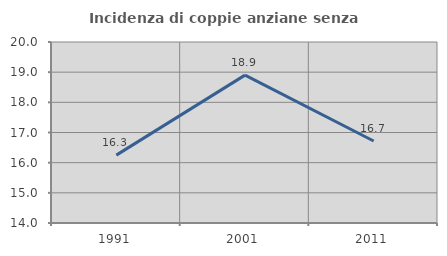
| Category | Incidenza di coppie anziane senza figli  |
|---|---|
| 1991.0 | 16.25 |
| 2001.0 | 18.902 |
| 2011.0 | 16.718 |